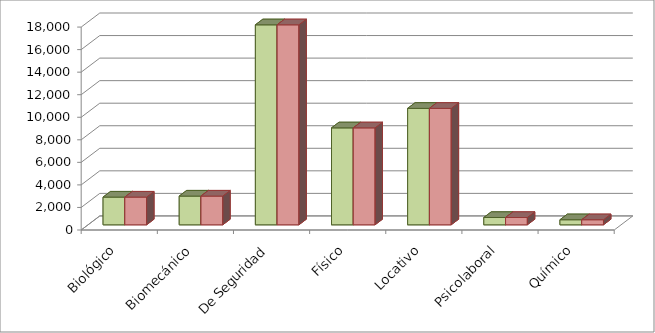
| Category | Series 0 | Series 1 |
|---|---|---|
| Biológico | 2460 | 2460 |
| Biomecánico | 2550 | 2550 |
| De Seguridad | 17740 | 17740 |
| Físico | 8600 | 8600 |
| Locativo | 10330 | 10330 |
| Psicolaboral | 650 | 650 |
| Químico | 450 | 450 |